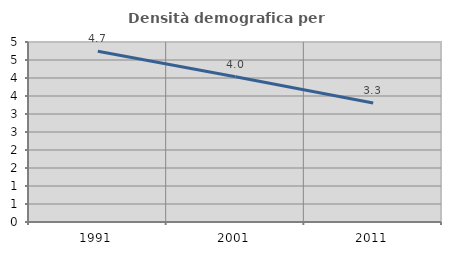
| Category | Densità demografica |
|---|---|
| 1991.0 | 4.745 |
| 2001.0 | 4.034 |
| 2011.0 | 3.304 |